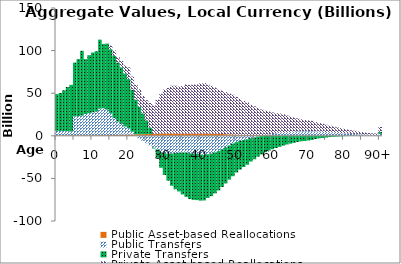
| Category | Public Asset-based Reallocations | Public Transfers | Private Transfers | Private Asset-based Reallocations |
|---|---|---|---|---|
| 0 | 464.265 | 5327.141 | 43114.664 | 0.147 |
|  | 491.598 | 5264.647 | 44554.877 | 0.081 |
| 2 | 524.783 | 5097.718 | 47837.915 | 1 |
| 3 | 563.611 | 4917.553 | 51825.532 | 17.052 |
| 4 | 589.275 | 4484.481 | 54740.585 | 30.349 |
| 5 | 595.918 | 22147.958 | 63168.351 | 32.212 |
| 6 | 607.639 | 22643.654 | 66777.827 | 25.423 |
| 7 | 628.134 | 23091.778 | 76078.914 | 25.971 |
| 8 | 648.508 | 24950.17 | 64417.392 | 26.449 |
| 9 | 671.957 | 25896.132 | 68074.34 | 34.323 |
| 10 | 699.114 | 26883.859 | 70106.734 | 39.615 |
| 11 | 728.097 | 27707.834 | 70791.615 | 40.448 |
| 12 | 759.326 | 31230.198 | 80827.423 | 48.859 |
| 13 | 789.728 | 31559.573 | 75443.301 | 55.794 |
| 14 | 821.126 | 29904.64 | 77551.387 | 62.543 |
| 15 | 902.919 | 25507.635 | 75180.632 | 4268.199 |
| 16 | 1011.055 | 20008.581 | 72856.075 | 6320.395 |
| 17 | 1113.159 | 15638.538 | 69360.887 | 6373.238 |
| 18 | 1210.732 | 12874.649 | 66262.578 | 7519.846 |
| 19 | 1332.67 | 9762.088 | 62003.52 | 9571.398 |
| 20 | 1464.187 | 7402.571 | 57705.656 | 13727.971 |
| 21 | 1594.581 | 3212.295 | 49291.975 | 15464.379 |
| 22 | 1719.662 | -380.896 | 40846.652 | 17499.692 |
| 23 | 1818.387 | -3543.047 | 32289.443 | 20621.888 |
| 24 | 1911.824 | -5936.552 | 24389.125 | 20384.046 |
| 25 | 2023.89 | -8768.149 | 16108.536 | 23704.653 |
| 26 | 2172.907 | -11475.33 | 7401.23 | 28910.394 |
| 27 | 2357.04 | -14014.523 | -930.189 | 33361.206 |
| 28 | 2487.114 | -16112.044 | -9707.664 | 40000.779 |
| 29 | 2683.013 | -19405.478 | -18141.051 | 46673.664 |
| 30 | 2751.789 | -20643.643 | -25353.312 | 51501.416 |
| 31 | 2758.735 | -21164.666 | -31488.832 | 53387.472 |
| 32 | 2724.503 | -20813.739 | -37891.84 | 56063.479 |
| 33 | 2703.315 | -20263.416 | -42486.469 | 56176.683 |
| 34 | 2615.391 | -19910.527 | -45461.279 | 55076.05 |
| 35 | 2598.705 | -19598.357 | -49264.412 | 55850.078 |
| 36 | 2564.903 | -19652.878 | -51983.337 | 57710.835 |
| 37 | 2613.938 | -20560.702 | -53673.302 | 57200.116 |
| 38 | 2643.017 | -21145.134 | -54041.12 | 57600.169 |
| 39 | 2615.996 | -21114.641 | -54351.47 | 57721.579 |
| 40 | 2653.518 | -21877.062 | -54249.189 | 58837.229 |
| 41 | 2671.544 | -22547.168 | -53349.186 | 59180.925 |
| 42 | 2605.817 | -21653.583 | -51309.113 | 57527.306 |
| 43 | 2534.283 | -20808.525 | -50049.681 | 56099.183 |
| 44 | 2431.696 | -19516.946 | -48054.225 | 54271.655 |
| 45 | 2301.357 | -17951.71 | -46223.011 | 52032.731 |
| 46 | 2103.645 | -15624.165 | -44445.739 | 50921.33 |
| 47 | 1924.933 | -13508.513 | -42364.303 | 49397.239 |
| 48 | 1754.173 | -11348.139 | -40118.827 | 47830.731 |
| 49 | 1573.657 | -9261.196 | -38198.297 | 46673.764 |
| 50 | 1401.974 | -7372.459 | -35715.833 | 44411.695 |
| 51 | 1280.481 | -6072.548 | -33582.577 | 42171.931 |
| 52 | 1172.084 | -4867.749 | -31735.833 | 39648.733 |
| 53 | 1105.248 | -4046.297 | -29970.921 | 37860.711 |
| 54 | 1009.662 | -2742.689 | -27518.759 | 35339.122 |
| 55 | 927.475 | -1877.908 | -25655.302 | 33665.268 |
| 56 | 832.138 | -855.266 | -23632.904 | 32032.958 |
| 57 | 771.986 | -323.686 | -21520.48 | 30059.949 |
| 58 | 697.315 | 532.851 | -19253.819 | 28236.955 |
| 59 | 637.946 | 1137.413 | -17372.957 | 26633.334 |
| 60 | 582.404 | 1665.199 | -15795.142 | 25187.49 |
| 61 | 532.351 | 2195.511 | -14349.298 | 23779.077 |
| 62 | 476.296 | 2920.467 | -13039.031 | 22763.251 |
| 63 | 438.124 | 3057.451 | -11542.852 | 21757.471 |
| 64 | 396.302 | 3411.663 | -10194.981 | 20098.956 |
| 65 | 348.724 | 3865.957 | -9244.144 | 18557.727 |
| 66 | 285.448 | 4501.483 | -8290.657 | 16828.056 |
| 67 | 241.362 | 4893.389 | -7240.057 | 15349.477 |
| 68 | 205.91 | 5144.05 | -6447.65 | 14027.374 |
| 69 | 181.499 | 5197.766 | -6115.907 | 13236.235 |
| 70 | 166.055 | 5280.329 | -5515.443 | 12681.202 |
| 71 | 151.164 | 5171.534 | -4913.79 | 12235.964 |
| 72 | 135.319 | 5014.719 | -3728.164 | 11040.588 |
| 73 | 120.574 | 4795.806 | -2937.749 | 10216.58 |
| 74 | 107.611 | 4647.597 | -2561.261 | 9359.488 |
| 75 | 97.472 | 4376.739 | -2080.91 | 8490.384 |
| 76 | 87.487 | 4088.554 | -1456.043 | 7792.53 |
| 77 | 79.744 | 3712.943 | -1197.527 | 7334.02 |
| 78 | 71.828 | 3406.898 | -929.935 | 6474.084 |
| 79 | 64.145 | 3089.362 | -695.158 | 5953.845 |
| 80 | 57.316 | 2823.288 | -435.795 | 5364.871 |
| 81 | 51.109 | 2579.563 | -303.188 | 4752.646 |
| 82 | 44.113 | 2288.06 | -261.258 | 4177.67 |
| 83 | 38.204 | 1992.89 | -232.548 | 3879.963 |
| 84 | 32.709 | 1713.975 | -44.191 | 3329.121 |
| 85 | 27.495 | 1440.459 | 84.754 | 2906.151 |
| 86 | 22.712 | 1217.666 | 118.876 | 2458.391 |
| 87 | 19.309 | 1044.475 | 93.173 | 2163.056 |
| 88 | 16.855 | 908.125 | 222.721 | 1825.688 |
| 89 | 14.811 | 783.009 | 236.687 | 1630.852 |
| 90+ | 62.839 | 2181.187 | 2504.396 | 5561.34 |